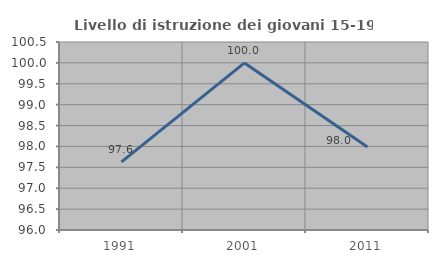
| Category | Livello di istruzione dei giovani 15-19 anni |
|---|---|
| 1991.0 | 97.632 |
| 2001.0 | 100 |
| 2011.0 | 97.987 |